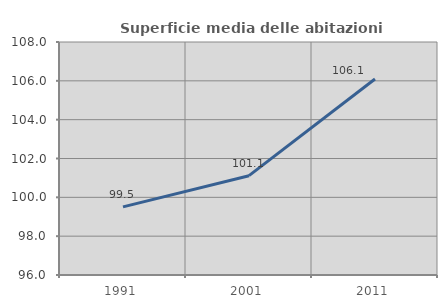
| Category | Superficie media delle abitazioni occupate |
|---|---|
| 1991.0 | 99.509 |
| 2001.0 | 101.116 |
| 2011.0 | 106.097 |